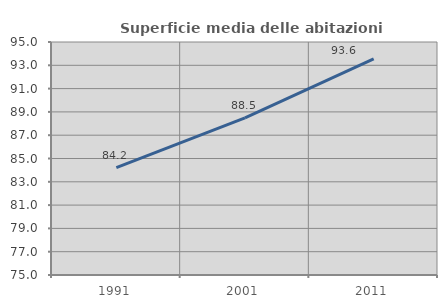
| Category | Superficie media delle abitazioni occupate |
|---|---|
| 1991.0 | 84.215 |
| 2001.0 | 88.487 |
| 2011.0 | 93.552 |